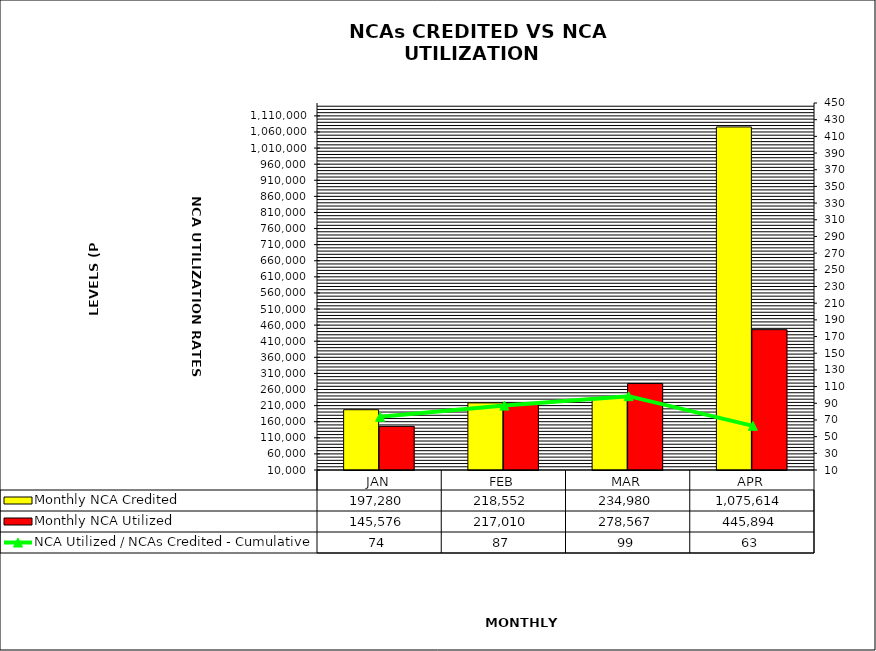
| Category | Monthly NCA Credited | Monthly NCA Utilized |
|---|---|---|
| JAN | 197280.374 | 145576.104 |
| FEB | 218551.98 | 217009.914 |
| MAR | 234979.638 | 278567.462 |
| APR | 1075614.496 | 445894.359 |